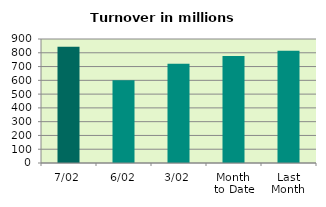
| Category | Series 0 |
|---|---|
| 7/02 | 844.484 |
| 6/02 | 601.039 |
| 3/02 | 720.435 |
| Month 
to Date | 775.741 |
| Last
Month | 814.821 |